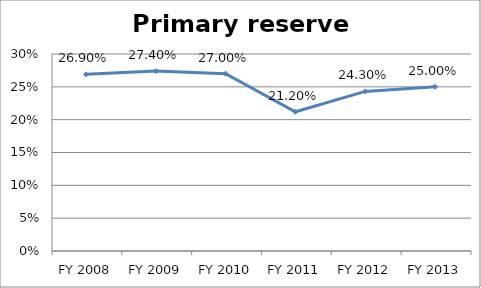
| Category | Primary reserve ratio |
|---|---|
| FY 2013 | 0.25 |
| FY 2012 | 0.243 |
| FY 2011 | 0.212 |
| FY 2010 | 0.27 |
| FY 2009 | 0.274 |
| FY 2008 | 0.269 |